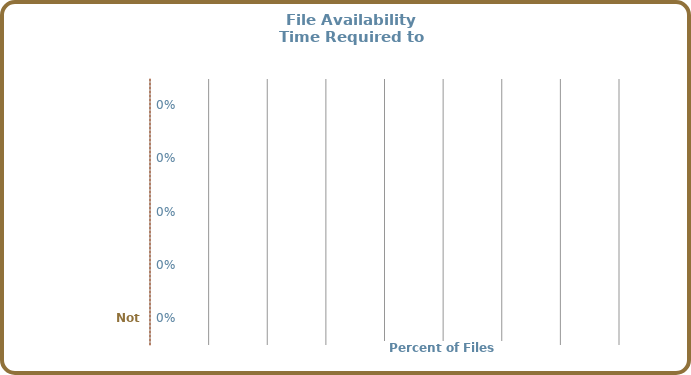
| Category | Retrieving Files |
|---|---|
|  | 0 |
|  | 0 |
|  | 0 |
|  | 0 |
| Not Found | 0 |